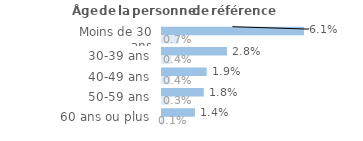
| Category | Series 1 | Series 0 |
|---|---|---|
| Moins de 30 ans | 0.061 | 0.007 |
| 30-39 ans | 0.028 | 0.004 |
| 40-49 ans | 0.019 | 0.004 |
| 50-59 ans | 0.018 | 0.003 |
| 60 ans ou plus | 0.014 | 0.001 |